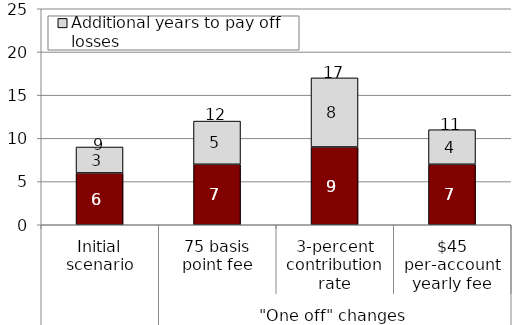
| Category | Years to break even | Additional years to pay off losses |
|---|---|---|
| 0 | 6 | 3 |
| 1 | 7 | 5 |
| 2 | 9 | 8 |
| 3 | 7 | 4 |